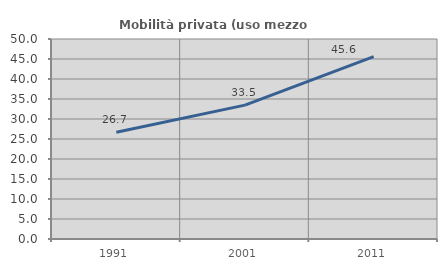
| Category | Mobilità privata (uso mezzo privato) |
|---|---|
| 1991.0 | 26.71 |
| 2001.0 | 33.471 |
| 2011.0 | 45.616 |